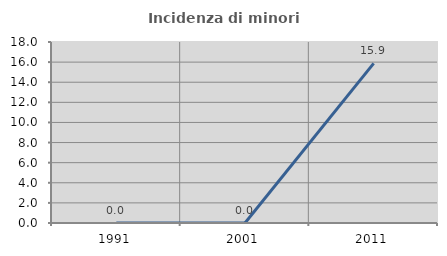
| Category | Incidenza di minori stranieri |
|---|---|
| 1991.0 | 0 |
| 2001.0 | 0 |
| 2011.0 | 15.873 |